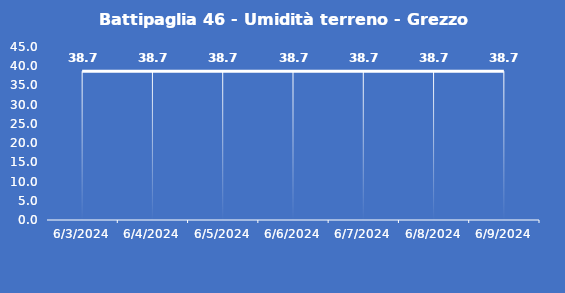
| Category | Battipaglia 46 - Umidità terreno - Grezzo (%VWC) |
|---|---|
| 6/3/24 | 38.7 |
| 6/4/24 | 38.7 |
| 6/5/24 | 38.7 |
| 6/6/24 | 38.7 |
| 6/7/24 | 38.7 |
| 6/8/24 | 38.7 |
| 6/9/24 | 38.7 |